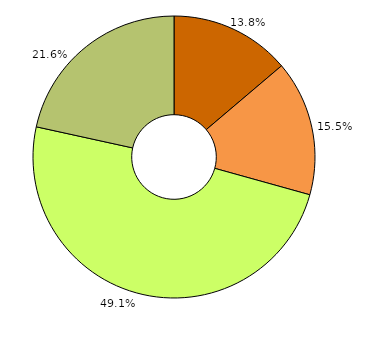
| Category | Series 0 |
|---|---|
| Akute Kindeswohlgefährdung | 461 |
| Latente Kindeswohlgefährdung | 518 |
| Keine Kindeswohlgefährdung, aber Hilfe/ Unterstützungsbedarf | 1640 |
| Keine Kindeswohlgefährdung und kein Hilfebedarf | 720 |